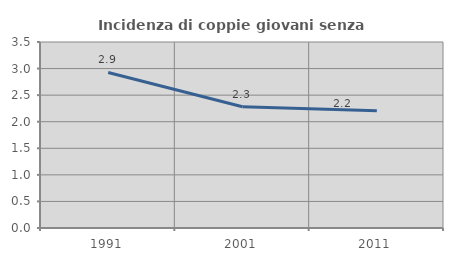
| Category | Incidenza di coppie giovani senza figli |
|---|---|
| 1991.0 | 2.927 |
| 2001.0 | 2.28 |
| 2011.0 | 2.206 |